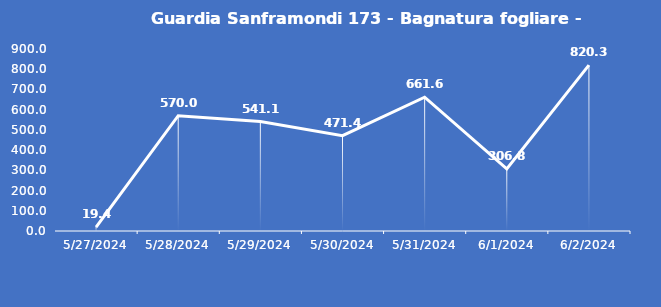
| Category | Guardia Sanframondi 173 - Bagnatura fogliare - Grezzo (min) |
|---|---|
| 5/27/24 | 19.4 |
| 5/28/24 | 570 |
| 5/29/24 | 541.1 |
| 5/30/24 | 471.4 |
| 5/31/24 | 661.6 |
| 6/1/24 | 306.8 |
| 6/2/24 | 820.3 |